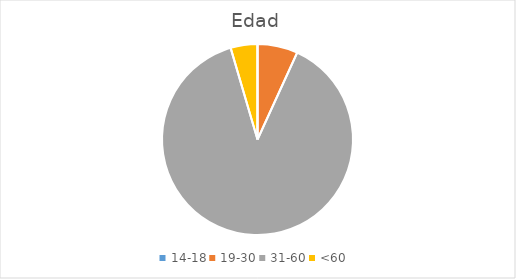
| Category | Series 0 |
|---|---|
| 14-18 | 0 |
| 19-30 | 6 |
| 31-60 | 78 |
| <60 | 4 |